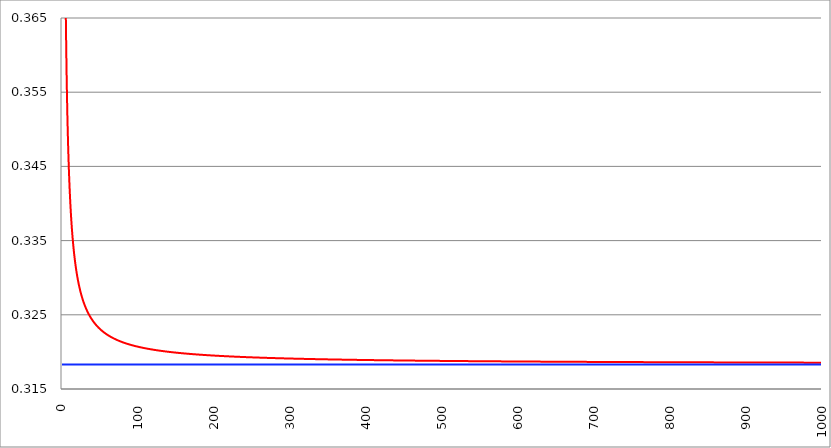
| Category | Series 1 | Series 0 | Series 2 |
|---|---|---|---|
| 0.0 | 1 |  | 0.318 |
| 1.0 | 0.447 |  | 0.318 |
| 2.0 | 0.423 |  | 0.318 |
| 3.0 | 0.394 |  | 0.318 |
| 4.0 | 0.377 |  | 0.318 |
| 5.0 | 0.366 |  | 0.318 |
| 6.0 | 0.358 |  | 0.318 |
| 7.0 | 0.352 |  | 0.318 |
| 8.0 | 0.348 |  | 0.318 |
| 9.0 | 0.345 |  | 0.318 |
| 10.0 | 0.342 |  | 0.318 |
| 11.0 | 0.34 |  | 0.318 |
| 12.0 | 0.338 |  | 0.318 |
| 13.0 | 0.337 |  | 0.318 |
| 14.0 | 0.335 |  | 0.318 |
| 15.0 | 0.334 |  | 0.318 |
| 16.0 | 0.333 |  | 0.318 |
| 17.0 | 0.332 |  | 0.318 |
| 18.0 | 0.332 |  | 0.318 |
| 19.0 | 0.331 |  | 0.318 |
| 20.0 | 0.33 |  | 0.318 |
| 21.0 | 0.33 |  | 0.318 |
| 22.0 | 0.329 |  | 0.318 |
| 23.0 | 0.329 |  | 0.318 |
| 24.0 | 0.328 |  | 0.318 |
| 25.0 | 0.328 |  | 0.318 |
| 26.0 | 0.327 |  | 0.318 |
| 27.0 | 0.327 |  | 0.318 |
| 28.0 | 0.327 |  | 0.318 |
| 29.0 | 0.327 |  | 0.318 |
| 30.0 | 0.326 |  | 0.318 |
| 31.0 | 0.326 |  | 0.318 |
| 32.0 | 0.326 |  | 0.318 |
| 33.0 | 0.326 |  | 0.318 |
| 34.0 | 0.325 |  | 0.318 |
| 35.0 | 0.325 |  | 0.318 |
| 36.0 | 0.325 |  | 0.318 |
| 37.0 | 0.325 |  | 0.318 |
| 38.0 | 0.325 |  | 0.318 |
| 39.0 | 0.324 |  | 0.318 |
| 40.0 | 0.324 |  | 0.318 |
| 41.0 | 0.324 |  | 0.318 |
| 42.0 | 0.324 |  | 0.318 |
| 43.0 | 0.324 |  | 0.318 |
| 44.0 | 0.324 |  | 0.318 |
| 45.0 | 0.324 |  | 0.318 |
| 46.0 | 0.323 |  | 0.318 |
| 47.0 | 0.323 |  | 0.318 |
| 48.0 | 0.323 |  | 0.318 |
| 49.0 | 0.323 |  | 0.318 |
| 50.0 | 0.323 |  | 0.318 |
| 51.0 | 0.323 |  | 0.318 |
| 52.0 | 0.323 |  | 0.318 |
| 53.0 | 0.323 |  | 0.318 |
| 54.0 | 0.323 |  | 0.318 |
| 55.0 | 0.323 |  | 0.318 |
| 56.0 | 0.323 |  | 0.318 |
| 57.0 | 0.322 |  | 0.318 |
| 58.0 | 0.322 |  | 0.318 |
| 59.0 | 0.322 |  | 0.318 |
| 60.0 | 0.322 |  | 0.318 |
| 61.0 | 0.322 |  | 0.318 |
| 62.0 | 0.322 |  | 0.318 |
| 63.0 | 0.322 |  | 0.318 |
| 64.0 | 0.322 |  | 0.318 |
| 65.0 | 0.322 |  | 0.318 |
| 66.0 | 0.322 |  | 0.318 |
| 67.0 | 0.322 |  | 0.318 |
| 68.0 | 0.322 |  | 0.318 |
| 69.0 | 0.322 |  | 0.318 |
| 70.0 | 0.322 |  | 0.318 |
| 71.0 | 0.322 |  | 0.318 |
| 72.0 | 0.322 |  | 0.318 |
| 73.0 | 0.322 |  | 0.318 |
| 74.0 | 0.322 |  | 0.318 |
| 75.0 | 0.321 |  | 0.318 |
| 76.0 | 0.321 |  | 0.318 |
| 77.0 | 0.321 |  | 0.318 |
| 78.0 | 0.321 |  | 0.318 |
| 79.0 | 0.321 |  | 0.318 |
| 80.0 | 0.321 |  | 0.318 |
| 81.0 | 0.321 |  | 0.318 |
| 82.0 | 0.321 |  | 0.318 |
| 83.0 | 0.321 |  | 0.318 |
| 84.0 | 0.321 |  | 0.318 |
| 85.0 | 0.321 |  | 0.318 |
| 86.0 | 0.321 |  | 0.318 |
| 87.0 | 0.321 |  | 0.318 |
| 88.0 | 0.321 |  | 0.318 |
| 89.0 | 0.321 |  | 0.318 |
| 90.0 | 0.321 |  | 0.318 |
| 91.0 | 0.321 |  | 0.318 |
| 92.0 | 0.321 |  | 0.318 |
| 93.0 | 0.321 |  | 0.318 |
| 94.0 | 0.321 |  | 0.318 |
| 95.0 | 0.321 |  | 0.318 |
| 96.0 | 0.321 |  | 0.318 |
| 97.0 | 0.321 |  | 0.318 |
| 98.0 | 0.321 |  | 0.318 |
| 99.0 | 0.321 |  | 0.318 |
| 100.0 | 0.321 |  | 0.318 |
| 101.0 | 0.321 |  | 0.318 |
| 102.0 | 0.321 |  | 0.318 |
| 103.0 | 0.321 |  | 0.318 |
| 104.0 | 0.321 |  | 0.318 |
| 105.0 | 0.321 |  | 0.318 |
| 106.0 | 0.321 |  | 0.318 |
| 107.0 | 0.321 |  | 0.318 |
| 108.0 | 0.321 |  | 0.318 |
| 109.0 | 0.32 |  | 0.318 |
| 110.0 | 0.32 |  | 0.318 |
| 111.0 | 0.32 |  | 0.318 |
| 112.0 | 0.32 |  | 0.318 |
| 113.0 | 0.32 |  | 0.318 |
| 114.0 | 0.32 |  | 0.318 |
| 115.0 | 0.32 |  | 0.318 |
| 116.0 | 0.32 |  | 0.318 |
| 117.0 | 0.32 |  | 0.318 |
| 118.0 | 0.32 |  | 0.318 |
| 119.0 | 0.32 |  | 0.318 |
| 120.0 | 0.32 |  | 0.318 |
| 121.0 | 0.32 |  | 0.318 |
| 122.0 | 0.32 |  | 0.318 |
| 123.0 | 0.32 |  | 0.318 |
| 124.0 | 0.32 |  | 0.318 |
| 125.0 | 0.32 |  | 0.318 |
| 126.0 | 0.32 |  | 0.318 |
| 127.0 | 0.32 |  | 0.318 |
| 128.0 | 0.32 |  | 0.318 |
| 129.0 | 0.32 |  | 0.318 |
| 130.0 | 0.32 |  | 0.318 |
| 131.0 | 0.32 |  | 0.318 |
| 132.0 | 0.32 |  | 0.318 |
| 133.0 | 0.32 |  | 0.318 |
| 134.0 | 0.32 |  | 0.318 |
| 135.0 | 0.32 |  | 0.318 |
| 136.0 | 0.32 |  | 0.318 |
| 137.0 | 0.32 |  | 0.318 |
| 138.0 | 0.32 |  | 0.318 |
| 139.0 | 0.32 |  | 0.318 |
| 140.0 | 0.32 |  | 0.318 |
| 141.0 | 0.32 |  | 0.318 |
| 142.0 | 0.32 |  | 0.318 |
| 143.0 | 0.32 |  | 0.318 |
| 144.0 | 0.32 |  | 0.318 |
| 145.0 | 0.32 |  | 0.318 |
| 146.0 | 0.32 |  | 0.318 |
| 147.0 | 0.32 |  | 0.318 |
| 148.0 | 0.32 |  | 0.318 |
| 149.0 | 0.32 |  | 0.318 |
| 150.0 | 0.32 |  | 0.318 |
| 151.0 | 0.32 |  | 0.318 |
| 152.0 | 0.32 |  | 0.318 |
| 153.0 | 0.32 |  | 0.318 |
| 154.0 | 0.32 |  | 0.318 |
| 155.0 | 0.32 |  | 0.318 |
| 156.0 | 0.32 |  | 0.318 |
| 157.0 | 0.32 |  | 0.318 |
| 158.0 | 0.32 |  | 0.318 |
| 159.0 | 0.32 |  | 0.318 |
| 160.0 | 0.32 |  | 0.318 |
| 161.0 | 0.32 |  | 0.318 |
| 162.0 | 0.32 |  | 0.318 |
| 163.0 | 0.32 |  | 0.318 |
| 164.0 | 0.32 |  | 0.318 |
| 165.0 | 0.32 |  | 0.318 |
| 166.0 | 0.32 |  | 0.318 |
| 167.0 | 0.32 |  | 0.318 |
| 168.0 | 0.32 |  | 0.318 |
| 169.0 | 0.32 |  | 0.318 |
| 170.0 | 0.32 |  | 0.318 |
| 171.0 | 0.32 |  | 0.318 |
| 172.0 | 0.32 |  | 0.318 |
| 173.0 | 0.32 |  | 0.318 |
| 174.0 | 0.32 |  | 0.318 |
| 175.0 | 0.32 |  | 0.318 |
| 176.0 | 0.32 |  | 0.318 |
| 177.0 | 0.32 |  | 0.318 |
| 178.0 | 0.32 |  | 0.318 |
| 179.0 | 0.32 |  | 0.318 |
| 180.0 | 0.32 |  | 0.318 |
| 181.0 | 0.32 |  | 0.318 |
| 182.0 | 0.32 |  | 0.318 |
| 183.0 | 0.32 |  | 0.318 |
| 184.0 | 0.32 |  | 0.318 |
| 185.0 | 0.32 |  | 0.318 |
| 186.0 | 0.32 |  | 0.318 |
| 187.0 | 0.32 |  | 0.318 |
| 188.0 | 0.32 |  | 0.318 |
| 189.0 | 0.32 |  | 0.318 |
| 190.0 | 0.32 |  | 0.318 |
| 191.0 | 0.32 |  | 0.318 |
| 192.0 | 0.32 |  | 0.318 |
| 193.0 | 0.32 |  | 0.318 |
| 194.0 | 0.32 |  | 0.318 |
| 195.0 | 0.32 |  | 0.318 |
| 196.0 | 0.32 |  | 0.318 |
| 197.0 | 0.32 |  | 0.318 |
| 198.0 | 0.32 |  | 0.318 |
| 199.0 | 0.32 |  | 0.318 |
| 200.0 | 0.32 |  | 0.318 |
| 201.0 | 0.319 |  | 0.318 |
| 202.0 | 0.319 |  | 0.318 |
| 203.0 | 0.319 |  | 0.318 |
| 204.0 | 0.319 |  | 0.318 |
| 205.0 | 0.319 |  | 0.318 |
| 206.0 | 0.319 |  | 0.318 |
| 207.0 | 0.319 |  | 0.318 |
| 208.0 | 0.319 |  | 0.318 |
| 209.0 | 0.319 |  | 0.318 |
| 210.0 | 0.319 |  | 0.318 |
| 211.0 | 0.319 |  | 0.318 |
| 212.0 | 0.319 |  | 0.318 |
| 213.0 | 0.319 |  | 0.318 |
| 214.0 | 0.319 |  | 0.318 |
| 215.0 | 0.319 |  | 0.318 |
| 216.0 | 0.319 |  | 0.318 |
| 217.0 | 0.319 |  | 0.318 |
| 218.0 | 0.319 |  | 0.318 |
| 219.0 | 0.319 |  | 0.318 |
| 220.0 | 0.319 |  | 0.318 |
| 221.0 | 0.319 |  | 0.318 |
| 222.0 | 0.319 |  | 0.318 |
| 223.0 | 0.319 |  | 0.318 |
| 224.0 | 0.319 |  | 0.318 |
| 225.0 | 0.319 |  | 0.318 |
| 226.0 | 0.319 |  | 0.318 |
| 227.0 | 0.319 |  | 0.318 |
| 228.0 | 0.319 |  | 0.318 |
| 229.0 | 0.319 |  | 0.318 |
| 230.0 | 0.319 |  | 0.318 |
| 231.0 | 0.319 |  | 0.318 |
| 232.0 | 0.319 |  | 0.318 |
| 233.0 | 0.319 |  | 0.318 |
| 234.0 | 0.319 |  | 0.318 |
| 235.0 | 0.319 |  | 0.318 |
| 236.0 | 0.319 |  | 0.318 |
| 237.0 | 0.319 |  | 0.318 |
| 238.0 | 0.319 |  | 0.318 |
| 239.0 | 0.319 |  | 0.318 |
| 240.0 | 0.319 |  | 0.318 |
| 241.0 | 0.319 |  | 0.318 |
| 242.0 | 0.319 |  | 0.318 |
| 243.0 | 0.319 |  | 0.318 |
| 244.0 | 0.319 |  | 0.318 |
| 245.0 | 0.319 |  | 0.318 |
| 246.0 | 0.319 |  | 0.318 |
| 247.0 | 0.319 |  | 0.318 |
| 248.0 | 0.319 |  | 0.318 |
| 249.0 | 0.319 |  | 0.318 |
| 250.0 | 0.319 |  | 0.318 |
| 251.0 | 0.319 |  | 0.318 |
| 252.0 | 0.319 |  | 0.318 |
| 253.0 | 0.319 |  | 0.318 |
| 254.0 | 0.319 |  | 0.318 |
| 255.0 | 0.319 |  | 0.318 |
| 256.0 | 0.319 |  | 0.318 |
| 257.0 | 0.319 |  | 0.318 |
| 258.0 | 0.319 |  | 0.318 |
| 259.0 | 0.319 |  | 0.318 |
| 260.0 | 0.319 |  | 0.318 |
| 261.0 | 0.319 |  | 0.318 |
| 262.0 | 0.319 |  | 0.318 |
| 263.0 | 0.319 |  | 0.318 |
| 264.0 | 0.319 |  | 0.318 |
| 265.0 | 0.319 |  | 0.318 |
| 266.0 | 0.319 |  | 0.318 |
| 267.0 | 0.319 |  | 0.318 |
| 268.0 | 0.319 |  | 0.318 |
| 269.0 | 0.319 |  | 0.318 |
| 270.0 | 0.319 |  | 0.318 |
| 271.0 | 0.319 |  | 0.318 |
| 272.0 | 0.319 |  | 0.318 |
| 273.0 | 0.319 |  | 0.318 |
| 274.0 | 0.319 |  | 0.318 |
| 275.0 | 0.319 |  | 0.318 |
| 276.0 | 0.319 |  | 0.318 |
| 277.0 | 0.319 |  | 0.318 |
| 278.0 | 0.319 |  | 0.318 |
| 279.0 | 0.319 |  | 0.318 |
| 280.0 | 0.319 |  | 0.318 |
| 281.0 | 0.319 |  | 0.318 |
| 282.0 | 0.319 |  | 0.318 |
| 283.0 | 0.319 |  | 0.318 |
| 284.0 | 0.319 |  | 0.318 |
| 285.0 | 0.319 |  | 0.318 |
| 286.0 | 0.319 |  | 0.318 |
| 287.0 | 0.319 |  | 0.318 |
| 288.0 | 0.319 |  | 0.318 |
| 289.0 | 0.319 |  | 0.318 |
| 290.0 | 0.319 |  | 0.318 |
| 291.0 | 0.319 |  | 0.318 |
| 292.0 | 0.319 |  | 0.318 |
| 293.0 | 0.319 |  | 0.318 |
| 294.0 | 0.319 |  | 0.318 |
| 295.0 | 0.319 |  | 0.318 |
| 296.0 | 0.319 |  | 0.318 |
| 297.0 | 0.319 |  | 0.318 |
| 298.0 | 0.319 |  | 0.318 |
| 299.0 | 0.319 |  | 0.318 |
| 300.0 | 0.319 |  | 0.318 |
| 301.0 | 0.319 |  | 0.318 |
| 302.0 | 0.319 |  | 0.318 |
| 303.0 | 0.319 |  | 0.318 |
| 304.0 | 0.319 |  | 0.318 |
| 305.0 | 0.319 |  | 0.318 |
| 306.0 | 0.319 |  | 0.318 |
| 307.0 | 0.319 |  | 0.318 |
| 308.0 | 0.319 |  | 0.318 |
| 309.0 | 0.319 |  | 0.318 |
| 310.0 | 0.319 |  | 0.318 |
| 311.0 | 0.319 |  | 0.318 |
| 312.0 | 0.319 |  | 0.318 |
| 313.0 | 0.319 |  | 0.318 |
| 314.0 | 0.319 |  | 0.318 |
| 315.0 | 0.319 |  | 0.318 |
| 316.0 | 0.319 |  | 0.318 |
| 317.0 | 0.319 |  | 0.318 |
| 318.0 | 0.319 |  | 0.318 |
| 319.0 | 0.319 |  | 0.318 |
| 320.0 | 0.319 |  | 0.318 |
| 321.0 | 0.319 |  | 0.318 |
| 322.0 | 0.319 |  | 0.318 |
| 323.0 | 0.319 |  | 0.318 |
| 324.0 | 0.319 |  | 0.318 |
| 325.0 | 0.319 |  | 0.318 |
| 326.0 | 0.319 |  | 0.318 |
| 327.0 | 0.319 |  | 0.318 |
| 328.0 | 0.319 |  | 0.318 |
| 329.0 | 0.319 |  | 0.318 |
| 330.0 | 0.319 |  | 0.318 |
| 331.0 | 0.319 |  | 0.318 |
| 332.0 | 0.319 |  | 0.318 |
| 333.0 | 0.319 |  | 0.318 |
| 334.0 | 0.319 |  | 0.318 |
| 335.0 | 0.319 |  | 0.318 |
| 336.0 | 0.319 |  | 0.318 |
| 337.0 | 0.319 |  | 0.318 |
| 338.0 | 0.319 |  | 0.318 |
| 339.0 | 0.319 |  | 0.318 |
| 340.0 | 0.319 |  | 0.318 |
| 341.0 | 0.319 |  | 0.318 |
| 342.0 | 0.319 |  | 0.318 |
| 343.0 | 0.319 |  | 0.318 |
| 344.0 | 0.319 |  | 0.318 |
| 345.0 | 0.319 |  | 0.318 |
| 346.0 | 0.319 |  | 0.318 |
| 347.0 | 0.319 |  | 0.318 |
| 348.0 | 0.319 |  | 0.318 |
| 349.0 | 0.319 |  | 0.318 |
| 350.0 | 0.319 |  | 0.318 |
| 351.0 | 0.319 |  | 0.318 |
| 352.0 | 0.319 |  | 0.318 |
| 353.0 | 0.319 |  | 0.318 |
| 354.0 | 0.319 |  | 0.318 |
| 355.0 | 0.319 |  | 0.318 |
| 356.0 | 0.319 |  | 0.318 |
| 357.0 | 0.319 |  | 0.318 |
| 358.0 | 0.319 |  | 0.318 |
| 359.0 | 0.319 |  | 0.318 |
| 360.0 | 0.319 |  | 0.318 |
| 361.0 | 0.319 |  | 0.318 |
| 362.0 | 0.319 |  | 0.318 |
| 363.0 | 0.319 |  | 0.318 |
| 364.0 | 0.319 |  | 0.318 |
| 365.0 | 0.319 |  | 0.318 |
| 366.0 | 0.319 |  | 0.318 |
| 367.0 | 0.319 |  | 0.318 |
| 368.0 | 0.319 |  | 0.318 |
| 369.0 | 0.319 |  | 0.318 |
| 370.0 | 0.319 |  | 0.318 |
| 371.0 | 0.319 |  | 0.318 |
| 372.0 | 0.319 |  | 0.318 |
| 373.0 | 0.319 |  | 0.318 |
| 374.0 | 0.319 |  | 0.318 |
| 375.0 | 0.319 |  | 0.318 |
| 376.0 | 0.319 |  | 0.318 |
| 377.0 | 0.319 |  | 0.318 |
| 378.0 | 0.319 |  | 0.318 |
| 379.0 | 0.319 |  | 0.318 |
| 380.0 | 0.319 |  | 0.318 |
| 381.0 | 0.319 |  | 0.318 |
| 382.0 | 0.319 |  | 0.318 |
| 383.0 | 0.319 |  | 0.318 |
| 384.0 | 0.319 |  | 0.318 |
| 385.0 | 0.319 |  | 0.318 |
| 386.0 | 0.319 |  | 0.318 |
| 387.0 | 0.319 |  | 0.318 |
| 388.0 | 0.319 |  | 0.318 |
| 389.0 | 0.319 |  | 0.318 |
| 390.0 | 0.319 |  | 0.318 |
| 391.0 | 0.319 |  | 0.318 |
| 392.0 | 0.319 |  | 0.318 |
| 393.0 | 0.319 |  | 0.318 |
| 394.0 | 0.319 |  | 0.318 |
| 395.0 | 0.319 |  | 0.318 |
| 396.0 | 0.319 |  | 0.318 |
| 397.0 | 0.319 |  | 0.318 |
| 398.0 | 0.319 |  | 0.318 |
| 399.0 | 0.319 |  | 0.318 |
| 400.0 | 0.319 |  | 0.318 |
| 401.0 | 0.319 |  | 0.318 |
| 402.0 | 0.319 |  | 0.318 |
| 403.0 | 0.319 |  | 0.318 |
| 404.0 | 0.319 |  | 0.318 |
| 405.0 | 0.319 |  | 0.318 |
| 406.0 | 0.319 |  | 0.318 |
| 407.0 | 0.319 |  | 0.318 |
| 408.0 | 0.319 |  | 0.318 |
| 409.0 | 0.319 |  | 0.318 |
| 410.0 | 0.319 |  | 0.318 |
| 411.0 | 0.319 |  | 0.318 |
| 412.0 | 0.319 |  | 0.318 |
| 413.0 | 0.319 |  | 0.318 |
| 414.0 | 0.319 |  | 0.318 |
| 415.0 | 0.319 |  | 0.318 |
| 416.0 | 0.319 |  | 0.318 |
| 417.0 | 0.319 |  | 0.318 |
| 418.0 | 0.319 |  | 0.318 |
| 419.0 | 0.319 |  | 0.318 |
| 420.0 | 0.319 |  | 0.318 |
| 421.0 | 0.319 |  | 0.318 |
| 422.0 | 0.319 |  | 0.318 |
| 423.0 | 0.319 |  | 0.318 |
| 424.0 | 0.319 |  | 0.318 |
| 425.0 | 0.319 |  | 0.318 |
| 426.0 | 0.319 |  | 0.318 |
| 427.0 | 0.319 |  | 0.318 |
| 428.0 | 0.319 |  | 0.318 |
| 429.0 | 0.319 |  | 0.318 |
| 430.0 | 0.319 |  | 0.318 |
| 431.0 | 0.319 |  | 0.318 |
| 432.0 | 0.319 |  | 0.318 |
| 433.0 | 0.319 |  | 0.318 |
| 434.0 | 0.319 |  | 0.318 |
| 435.0 | 0.319 |  | 0.318 |
| 436.0 | 0.319 |  | 0.318 |
| 437.0 | 0.319 |  | 0.318 |
| 438.0 | 0.319 |  | 0.318 |
| 439.0 | 0.319 |  | 0.318 |
| 440.0 | 0.319 |  | 0.318 |
| 441.0 | 0.319 |  | 0.318 |
| 442.0 | 0.319 |  | 0.318 |
| 443.0 | 0.319 |  | 0.318 |
| 444.0 | 0.319 |  | 0.318 |
| 445.0 | 0.319 |  | 0.318 |
| 446.0 | 0.319 |  | 0.318 |
| 447.0 | 0.319 |  | 0.318 |
| 448.0 | 0.319 |  | 0.318 |
| 449.0 | 0.319 |  | 0.318 |
| 450.0 | 0.319 |  | 0.318 |
| 451.0 | 0.319 |  | 0.318 |
| 452.0 | 0.319 |  | 0.318 |
| 453.0 | 0.319 |  | 0.318 |
| 454.0 | 0.319 |  | 0.318 |
| 455.0 | 0.319 |  | 0.318 |
| 456.0 | 0.319 |  | 0.318 |
| 457.0 | 0.319 |  | 0.318 |
| 458.0 | 0.319 |  | 0.318 |
| 459.0 | 0.319 |  | 0.318 |
| 460.0 | 0.319 |  | 0.318 |
| 461.0 | 0.319 |  | 0.318 |
| 462.0 | 0.319 |  | 0.318 |
| 463.0 | 0.319 |  | 0.318 |
| 464.0 | 0.319 |  | 0.318 |
| 465.0 | 0.319 |  | 0.318 |
| 466.0 | 0.319 |  | 0.318 |
| 467.0 | 0.319 |  | 0.318 |
| 468.0 | 0.319 |  | 0.318 |
| 469.0 | 0.319 |  | 0.318 |
| 470.0 | 0.319 |  | 0.318 |
| 471.0 | 0.319 |  | 0.318 |
| 472.0 | 0.319 |  | 0.318 |
| 473.0 | 0.319 |  | 0.318 |
| 474.0 | 0.319 |  | 0.318 |
| 475.0 | 0.319 |  | 0.318 |
| 476.0 | 0.319 |  | 0.318 |
| 477.0 | 0.319 |  | 0.318 |
| 478.0 | 0.319 |  | 0.318 |
| 479.0 | 0.319 |  | 0.318 |
| 480.0 | 0.319 |  | 0.318 |
| 481.0 | 0.319 |  | 0.318 |
| 482.0 | 0.319 |  | 0.318 |
| 483.0 | 0.319 |  | 0.318 |
| 484.0 | 0.319 |  | 0.318 |
| 485.0 | 0.319 |  | 0.318 |
| 486.0 | 0.319 |  | 0.318 |
| 487.0 | 0.319 |  | 0.318 |
| 488.0 | 0.319 |  | 0.318 |
| 489.0 | 0.319 |  | 0.318 |
| 490.0 | 0.319 |  | 0.318 |
| 491.0 | 0.319 |  | 0.318 |
| 492.0 | 0.319 |  | 0.318 |
| 493.0 | 0.319 |  | 0.318 |
| 494.0 | 0.319 |  | 0.318 |
| 495.0 | 0.319 |  | 0.318 |
| 496.0 | 0.319 |  | 0.318 |
| 497.0 | 0.319 |  | 0.318 |
| 498.0 | 0.319 |  | 0.318 |
| 499.0 | 0.319 |  | 0.318 |
| 500.0 | 0.319 |  | 0.318 |
| 501.0 | 0.319 |  | 0.318 |
| 502.0 | 0.319 |  | 0.318 |
| 503.0 | 0.319 |  | 0.318 |
| 504.0 | 0.319 |  | 0.318 |
| 505.0 | 0.319 |  | 0.318 |
| 506.0 | 0.319 |  | 0.318 |
| 507.0 | 0.319 |  | 0.318 |
| 508.0 | 0.319 |  | 0.318 |
| 509.0 | 0.319 |  | 0.318 |
| 510.0 | 0.319 |  | 0.318 |
| 511.0 | 0.319 |  | 0.318 |
| 512.0 | 0.319 |  | 0.318 |
| 513.0 | 0.319 |  | 0.318 |
| 514.0 | 0.319 |  | 0.318 |
| 515.0 | 0.319 |  | 0.318 |
| 516.0 | 0.319 |  | 0.318 |
| 517.0 | 0.319 |  | 0.318 |
| 518.0 | 0.319 |  | 0.318 |
| 519.0 | 0.319 |  | 0.318 |
| 520.0 | 0.319 |  | 0.318 |
| 521.0 | 0.319 |  | 0.318 |
| 522.0 | 0.319 |  | 0.318 |
| 523.0 | 0.319 |  | 0.318 |
| 524.0 | 0.319 |  | 0.318 |
| 525.0 | 0.319 |  | 0.318 |
| 526.0 | 0.319 |  | 0.318 |
| 527.0 | 0.319 |  | 0.318 |
| 528.0 | 0.319 |  | 0.318 |
| 529.0 | 0.319 |  | 0.318 |
| 530.0 | 0.319 |  | 0.318 |
| 531.0 | 0.319 |  | 0.318 |
| 532.0 | 0.319 |  | 0.318 |
| 533.0 | 0.319 |  | 0.318 |
| 534.0 | 0.319 |  | 0.318 |
| 535.0 | 0.319 |  | 0.318 |
| 536.0 | 0.319 |  | 0.318 |
| 537.0 | 0.319 |  | 0.318 |
| 538.0 | 0.319 |  | 0.318 |
| 539.0 | 0.319 |  | 0.318 |
| 540.0 | 0.319 |  | 0.318 |
| 541.0 | 0.319 |  | 0.318 |
| 542.0 | 0.319 |  | 0.318 |
| 543.0 | 0.319 |  | 0.318 |
| 544.0 | 0.319 |  | 0.318 |
| 545.0 | 0.319 |  | 0.318 |
| 546.0 | 0.319 |  | 0.318 |
| 547.0 | 0.319 |  | 0.318 |
| 548.0 | 0.319 |  | 0.318 |
| 549.0 | 0.319 |  | 0.318 |
| 550.0 | 0.319 |  | 0.318 |
| 551.0 | 0.319 |  | 0.318 |
| 552.0 | 0.319 |  | 0.318 |
| 553.0 | 0.319 |  | 0.318 |
| 554.0 | 0.319 |  | 0.318 |
| 555.0 | 0.319 |  | 0.318 |
| 556.0 | 0.319 |  | 0.318 |
| 557.0 | 0.319 |  | 0.318 |
| 558.0 | 0.319 |  | 0.318 |
| 559.0 | 0.319 |  | 0.318 |
| 560.0 | 0.319 |  | 0.318 |
| 561.0 | 0.319 |  | 0.318 |
| 562.0 | 0.319 |  | 0.318 |
| 563.0 | 0.319 |  | 0.318 |
| 564.0 | 0.319 |  | 0.318 |
| 565.0 | 0.319 |  | 0.318 |
| 566.0 | 0.319 |  | 0.318 |
| 567.0 | 0.319 |  | 0.318 |
| 568.0 | 0.319 |  | 0.318 |
| 569.0 | 0.319 |  | 0.318 |
| 570.0 | 0.319 |  | 0.318 |
| 571.0 | 0.319 |  | 0.318 |
| 572.0 | 0.319 |  | 0.318 |
| 573.0 | 0.319 |  | 0.318 |
| 574.0 | 0.319 |  | 0.318 |
| 575.0 | 0.319 |  | 0.318 |
| 576.0 | 0.319 |  | 0.318 |
| 577.0 | 0.319 |  | 0.318 |
| 578.0 | 0.319 |  | 0.318 |
| 579.0 | 0.319 |  | 0.318 |
| 580.0 | 0.319 |  | 0.318 |
| 581.0 | 0.319 |  | 0.318 |
| 582.0 | 0.319 |  | 0.318 |
| 583.0 | 0.319 |  | 0.318 |
| 584.0 | 0.319 |  | 0.318 |
| 585.0 | 0.319 |  | 0.318 |
| 586.0 | 0.319 |  | 0.318 |
| 587.0 | 0.319 |  | 0.318 |
| 588.0 | 0.319 |  | 0.318 |
| 589.0 | 0.319 |  | 0.318 |
| 590.0 | 0.319 |  | 0.318 |
| 591.0 | 0.319 |  | 0.318 |
| 592.0 | 0.319 |  | 0.318 |
| 593.0 | 0.319 |  | 0.318 |
| 594.0 | 0.319 |  | 0.318 |
| 595.0 | 0.319 |  | 0.318 |
| 596.0 | 0.319 |  | 0.318 |
| 597.0 | 0.319 |  | 0.318 |
| 598.0 | 0.319 |  | 0.318 |
| 599.0 | 0.319 |  | 0.318 |
| 600.0 | 0.319 |  | 0.318 |
| 601.0 | 0.319 |  | 0.318 |
| 602.0 | 0.319 |  | 0.318 |
| 603.0 | 0.319 |  | 0.318 |
| 604.0 | 0.319 |  | 0.318 |
| 605.0 | 0.319 |  | 0.318 |
| 606.0 | 0.319 |  | 0.318 |
| 607.0 | 0.319 |  | 0.318 |
| 608.0 | 0.319 |  | 0.318 |
| 609.0 | 0.319 |  | 0.318 |
| 610.0 | 0.319 |  | 0.318 |
| 611.0 | 0.319 |  | 0.318 |
| 612.0 | 0.319 |  | 0.318 |
| 613.0 | 0.319 |  | 0.318 |
| 614.0 | 0.319 |  | 0.318 |
| 615.0 | 0.319 |  | 0.318 |
| 616.0 | 0.319 |  | 0.318 |
| 617.0 | 0.319 |  | 0.318 |
| 618.0 | 0.319 |  | 0.318 |
| 619.0 | 0.319 |  | 0.318 |
| 620.0 | 0.319 |  | 0.318 |
| 621.0 | 0.319 |  | 0.318 |
| 622.0 | 0.319 |  | 0.318 |
| 623.0 | 0.319 |  | 0.318 |
| 624.0 | 0.319 |  | 0.318 |
| 625.0 | 0.319 |  | 0.318 |
| 626.0 | 0.319 |  | 0.318 |
| 627.0 | 0.319 |  | 0.318 |
| 628.0 | 0.319 |  | 0.318 |
| 629.0 | 0.319 |  | 0.318 |
| 630.0 | 0.319 |  | 0.318 |
| 631.0 | 0.319 |  | 0.318 |
| 632.0 | 0.319 |  | 0.318 |
| 633.0 | 0.319 |  | 0.318 |
| 634.0 | 0.319 |  | 0.318 |
| 635.0 | 0.319 |  | 0.318 |
| 636.0 | 0.319 |  | 0.318 |
| 637.0 | 0.319 |  | 0.318 |
| 638.0 | 0.319 |  | 0.318 |
| 639.0 | 0.319 |  | 0.318 |
| 640.0 | 0.319 |  | 0.318 |
| 641.0 | 0.319 |  | 0.318 |
| 642.0 | 0.319 |  | 0.318 |
| 643.0 | 0.319 |  | 0.318 |
| 644.0 | 0.319 |  | 0.318 |
| 645.0 | 0.319 |  | 0.318 |
| 646.0 | 0.319 |  | 0.318 |
| 647.0 | 0.319 |  | 0.318 |
| 648.0 | 0.319 |  | 0.318 |
| 649.0 | 0.319 |  | 0.318 |
| 650.0 | 0.319 |  | 0.318 |
| 651.0 | 0.319 |  | 0.318 |
| 652.0 | 0.319 |  | 0.318 |
| 653.0 | 0.319 |  | 0.318 |
| 654.0 | 0.319 |  | 0.318 |
| 655.0 | 0.319 |  | 0.318 |
| 656.0 | 0.319 |  | 0.318 |
| 657.0 | 0.319 |  | 0.318 |
| 658.0 | 0.319 |  | 0.318 |
| 659.0 | 0.319 |  | 0.318 |
| 660.0 | 0.319 |  | 0.318 |
| 661.0 | 0.319 |  | 0.318 |
| 662.0 | 0.319 |  | 0.318 |
| 663.0 | 0.319 |  | 0.318 |
| 664.0 | 0.319 |  | 0.318 |
| 665.0 | 0.319 |  | 0.318 |
| 666.0 | 0.319 |  | 0.318 |
| 667.0 | 0.319 |  | 0.318 |
| 668.0 | 0.319 |  | 0.318 |
| 669.0 | 0.319 |  | 0.318 |
| 670.0 | 0.319 |  | 0.318 |
| 671.0 | 0.319 |  | 0.318 |
| 672.0 | 0.319 |  | 0.318 |
| 673.0 | 0.319 |  | 0.318 |
| 674.0 | 0.319 |  | 0.318 |
| 675.0 | 0.319 |  | 0.318 |
| 676.0 | 0.319 |  | 0.318 |
| 677.0 | 0.319 |  | 0.318 |
| 678.0 | 0.319 |  | 0.318 |
| 679.0 | 0.319 |  | 0.318 |
| 680.0 | 0.319 |  | 0.318 |
| 681.0 | 0.319 |  | 0.318 |
| 682.0 | 0.319 |  | 0.318 |
| 683.0 | 0.319 |  | 0.318 |
| 684.0 | 0.319 |  | 0.318 |
| 685.0 | 0.319 |  | 0.318 |
| 686.0 | 0.319 |  | 0.318 |
| 687.0 | 0.319 |  | 0.318 |
| 688.0 | 0.319 |  | 0.318 |
| 689.0 | 0.319 |  | 0.318 |
| 690.0 | 0.319 |  | 0.318 |
| 691.0 | 0.319 |  | 0.318 |
| 692.0 | 0.319 |  | 0.318 |
| 693.0 | 0.319 |  | 0.318 |
| 694.0 | 0.319 |  | 0.318 |
| 695.0 | 0.319 |  | 0.318 |
| 696.0 | 0.319 |  | 0.318 |
| 697.0 | 0.319 |  | 0.318 |
| 698.0 | 0.319 |  | 0.318 |
| 699.0 | 0.319 |  | 0.318 |
| 700.0 | 0.319 |  | 0.318 |
| 701.0 | 0.319 |  | 0.318 |
| 702.0 | 0.319 |  | 0.318 |
| 703.0 | 0.319 |  | 0.318 |
| 704.0 | 0.319 |  | 0.318 |
| 705.0 | 0.319 |  | 0.318 |
| 706.0 | 0.319 |  | 0.318 |
| 707.0 | 0.319 |  | 0.318 |
| 708.0 | 0.319 |  | 0.318 |
| 709.0 | 0.319 |  | 0.318 |
| 710.0 | 0.319 |  | 0.318 |
| 711.0 | 0.319 |  | 0.318 |
| 712.0 | 0.319 |  | 0.318 |
| 713.0 | 0.319 |  | 0.318 |
| 714.0 | 0.319 |  | 0.318 |
| 715.0 | 0.319 |  | 0.318 |
| 716.0 | 0.319 |  | 0.318 |
| 717.0 | 0.319 |  | 0.318 |
| 718.0 | 0.319 |  | 0.318 |
| 719.0 | 0.319 |  | 0.318 |
| 720.0 | 0.319 |  | 0.318 |
| 721.0 | 0.319 |  | 0.318 |
| 722.0 | 0.319 |  | 0.318 |
| 723.0 | 0.319 |  | 0.318 |
| 724.0 | 0.319 |  | 0.318 |
| 725.0 | 0.319 |  | 0.318 |
| 726.0 | 0.319 |  | 0.318 |
| 727.0 | 0.319 |  | 0.318 |
| 728.0 | 0.319 |  | 0.318 |
| 729.0 | 0.319 |  | 0.318 |
| 730.0 | 0.319 |  | 0.318 |
| 731.0 | 0.319 |  | 0.318 |
| 732.0 | 0.319 |  | 0.318 |
| 733.0 | 0.319 |  | 0.318 |
| 734.0 | 0.319 |  | 0.318 |
| 735.0 | 0.319 |  | 0.318 |
| 736.0 | 0.319 |  | 0.318 |
| 737.0 | 0.319 |  | 0.318 |
| 738.0 | 0.319 |  | 0.318 |
| 739.0 | 0.319 |  | 0.318 |
| 740.0 | 0.319 |  | 0.318 |
| 741.0 | 0.319 |  | 0.318 |
| 742.0 | 0.319 |  | 0.318 |
| 743.0 | 0.319 |  | 0.318 |
| 744.0 | 0.319 |  | 0.318 |
| 745.0 | 0.319 |  | 0.318 |
| 746.0 | 0.319 |  | 0.318 |
| 747.0 | 0.319 |  | 0.318 |
| 748.0 | 0.319 |  | 0.318 |
| 749.0 | 0.319 |  | 0.318 |
| 750.0 | 0.319 |  | 0.318 |
| 751.0 | 0.319 |  | 0.318 |
| 752.0 | 0.319 |  | 0.318 |
| 753.0 | 0.319 |  | 0.318 |
| 754.0 | 0.319 |  | 0.318 |
| 755.0 | 0.319 |  | 0.318 |
| 756.0 | 0.319 |  | 0.318 |
| 757.0 | 0.319 |  | 0.318 |
| 758.0 | 0.319 |  | 0.318 |
| 759.0 | 0.319 |  | 0.318 |
| 760.0 | 0.319 |  | 0.318 |
| 761.0 | 0.319 |  | 0.318 |
| 762.0 | 0.319 |  | 0.318 |
| 763.0 | 0.319 |  | 0.318 |
| 764.0 | 0.319 |  | 0.318 |
| 765.0 | 0.319 |  | 0.318 |
| 766.0 | 0.319 |  | 0.318 |
| 767.0 | 0.319 |  | 0.318 |
| 768.0 | 0.319 |  | 0.318 |
| 769.0 | 0.319 |  | 0.318 |
| 770.0 | 0.319 |  | 0.318 |
| 771.0 | 0.319 |  | 0.318 |
| 772.0 | 0.319 |  | 0.318 |
| 773.0 | 0.319 |  | 0.318 |
| 774.0 | 0.319 |  | 0.318 |
| 775.0 | 0.319 |  | 0.318 |
| 776.0 | 0.319 |  | 0.318 |
| 777.0 | 0.319 |  | 0.318 |
| 778.0 | 0.319 |  | 0.318 |
| 779.0 | 0.319 |  | 0.318 |
| 780.0 | 0.319 |  | 0.318 |
| 781.0 | 0.319 |  | 0.318 |
| 782.0 | 0.319 |  | 0.318 |
| 783.0 | 0.319 |  | 0.318 |
| 784.0 | 0.319 |  | 0.318 |
| 785.0 | 0.319 |  | 0.318 |
| 786.0 | 0.319 |  | 0.318 |
| 787.0 | 0.319 |  | 0.318 |
| 788.0 | 0.319 |  | 0.318 |
| 789.0 | 0.319 |  | 0.318 |
| 790.0 | 0.319 |  | 0.318 |
| 791.0 | 0.319 |  | 0.318 |
| 792.0 | 0.319 |  | 0.318 |
| 793.0 | 0.319 |  | 0.318 |
| 794.0 | 0.319 |  | 0.318 |
| 795.0 | 0.319 |  | 0.318 |
| 796.0 | 0.319 |  | 0.318 |
| 797.0 | 0.319 |  | 0.318 |
| 798.0 | 0.319 |  | 0.318 |
| 799.0 | 0.319 |  | 0.318 |
| 800.0 | 0.319 |  | 0.318 |
| 801.0 | 0.319 |  | 0.318 |
| 802.0 | 0.319 |  | 0.318 |
| 803.0 | 0.319 |  | 0.318 |
| 804.0 | 0.319 |  | 0.318 |
| 805.0 | 0.319 |  | 0.318 |
| 806.0 | 0.319 |  | 0.318 |
| 807.0 | 0.319 |  | 0.318 |
| 808.0 | 0.319 |  | 0.318 |
| 809.0 | 0.319 |  | 0.318 |
| 810.0 | 0.319 |  | 0.318 |
| 811.0 | 0.319 |  | 0.318 |
| 812.0 | 0.319 |  | 0.318 |
| 813.0 | 0.319 |  | 0.318 |
| 814.0 | 0.319 |  | 0.318 |
| 815.0 | 0.319 |  | 0.318 |
| 816.0 | 0.319 |  | 0.318 |
| 817.0 | 0.319 |  | 0.318 |
| 818.0 | 0.319 |  | 0.318 |
| 819.0 | 0.319 |  | 0.318 |
| 820.0 | 0.319 |  | 0.318 |
| 821.0 | 0.319 |  | 0.318 |
| 822.0 | 0.319 |  | 0.318 |
| 823.0 | 0.319 |  | 0.318 |
| 824.0 | 0.319 |  | 0.318 |
| 825.0 | 0.319 |  | 0.318 |
| 826.0 | 0.319 |  | 0.318 |
| 827.0 | 0.319 |  | 0.318 |
| 828.0 | 0.319 |  | 0.318 |
| 829.0 | 0.319 |  | 0.318 |
| 830.0 | 0.319 |  | 0.318 |
| 831.0 | 0.319 |  | 0.318 |
| 832.0 | 0.319 |  | 0.318 |
| 833.0 | 0.319 |  | 0.318 |
| 834.0 | 0.319 |  | 0.318 |
| 835.0 | 0.319 |  | 0.318 |
| 836.0 | 0.319 |  | 0.318 |
| 837.0 | 0.319 |  | 0.318 |
| 838.0 | 0.319 |  | 0.318 |
| 839.0 | 0.319 |  | 0.318 |
| 840.0 | 0.319 |  | 0.318 |
| 841.0 | 0.319 |  | 0.318 |
| 842.0 | 0.319 |  | 0.318 |
| 843.0 | 0.319 |  | 0.318 |
| 844.0 | 0.319 |  | 0.318 |
| 845.0 | 0.319 |  | 0.318 |
| 846.0 | 0.319 |  | 0.318 |
| 847.0 | 0.319 |  | 0.318 |
| 848.0 | 0.319 |  | 0.318 |
| 849.0 | 0.319 |  | 0.318 |
| 850.0 | 0.319 |  | 0.318 |
| 851.0 | 0.319 |  | 0.318 |
| 852.0 | 0.319 |  | 0.318 |
| 853.0 | 0.319 |  | 0.318 |
| 854.0 | 0.319 |  | 0.318 |
| 855.0 | 0.319 |  | 0.318 |
| 856.0 | 0.319 |  | 0.318 |
| 857.0 | 0.319 |  | 0.318 |
| 858.0 | 0.319 |  | 0.318 |
| 859.0 | 0.319 |  | 0.318 |
| 860.0 | 0.319 |  | 0.318 |
| 861.0 | 0.319 |  | 0.318 |
| 862.0 | 0.319 |  | 0.318 |
| 863.0 | 0.319 |  | 0.318 |
| 864.0 | 0.319 |  | 0.318 |
| 865.0 | 0.319 |  | 0.318 |
| 866.0 | 0.319 |  | 0.318 |
| 867.0 | 0.319 |  | 0.318 |
| 868.0 | 0.319 |  | 0.318 |
| 869.0 | 0.319 |  | 0.318 |
| 870.0 | 0.319 |  | 0.318 |
| 871.0 | 0.319 |  | 0.318 |
| 872.0 | 0.319 |  | 0.318 |
| 873.0 | 0.319 |  | 0.318 |
| 874.0 | 0.319 |  | 0.318 |
| 875.0 | 0.319 |  | 0.318 |
| 876.0 | 0.319 |  | 0.318 |
| 877.0 | 0.319 |  | 0.318 |
| 878.0 | 0.319 |  | 0.318 |
| 879.0 | 0.319 |  | 0.318 |
| 880.0 | 0.319 |  | 0.318 |
| 881.0 | 0.319 |  | 0.318 |
| 882.0 | 0.319 |  | 0.318 |
| 883.0 | 0.319 |  | 0.318 |
| 884.0 | 0.319 |  | 0.318 |
| 885.0 | 0.319 |  | 0.318 |
| 886.0 | 0.319 |  | 0.318 |
| 887.0 | 0.319 |  | 0.318 |
| 888.0 | 0.319 |  | 0.318 |
| 889.0 | 0.319 |  | 0.318 |
| 890.0 | 0.319 |  | 0.318 |
| 891.0 | 0.319 |  | 0.318 |
| 892.0 | 0.319 |  | 0.318 |
| 893.0 | 0.319 |  | 0.318 |
| 894.0 | 0.319 |  | 0.318 |
| 895.0 | 0.319 |  | 0.318 |
| 896.0 | 0.319 |  | 0.318 |
| 897.0 | 0.319 |  | 0.318 |
| 898.0 | 0.319 |  | 0.318 |
| 899.0 | 0.319 |  | 0.318 |
| 900.0 | 0.319 |  | 0.318 |
| 901.0 | 0.319 |  | 0.318 |
| 902.0 | 0.319 |  | 0.318 |
| 903.0 | 0.319 |  | 0.318 |
| 904.0 | 0.319 |  | 0.318 |
| 905.0 | 0.319 |  | 0.318 |
| 906.0 | 0.319 |  | 0.318 |
| 907.0 | 0.319 |  | 0.318 |
| 908.0 | 0.319 |  | 0.318 |
| 909.0 | 0.319 |  | 0.318 |
| 910.0 | 0.319 |  | 0.318 |
| 911.0 | 0.319 |  | 0.318 |
| 912.0 | 0.319 |  | 0.318 |
| 913.0 | 0.319 |  | 0.318 |
| 914.0 | 0.319 |  | 0.318 |
| 915.0 | 0.319 |  | 0.318 |
| 916.0 | 0.319 |  | 0.318 |
| 917.0 | 0.319 |  | 0.318 |
| 918.0 | 0.319 |  | 0.318 |
| 919.0 | 0.319 |  | 0.318 |
| 920.0 | 0.319 |  | 0.318 |
| 921.0 | 0.319 |  | 0.318 |
| 922.0 | 0.319 |  | 0.318 |
| 923.0 | 0.319 |  | 0.318 |
| 924.0 | 0.319 |  | 0.318 |
| 925.0 | 0.319 |  | 0.318 |
| 926.0 | 0.319 |  | 0.318 |
| 927.0 | 0.319 |  | 0.318 |
| 928.0 | 0.319 |  | 0.318 |
| 929.0 | 0.319 |  | 0.318 |
| 930.0 | 0.319 |  | 0.318 |
| 931.0 | 0.319 |  | 0.318 |
| 932.0 | 0.319 |  | 0.318 |
| 933.0 | 0.319 |  | 0.318 |
| 934.0 | 0.319 |  | 0.318 |
| 935.0 | 0.319 |  | 0.318 |
| 936.0 | 0.319 |  | 0.318 |
| 937.0 | 0.319 |  | 0.318 |
| 938.0 | 0.319 |  | 0.318 |
| 939.0 | 0.319 |  | 0.318 |
| 940.0 | 0.319 |  | 0.318 |
| 941.0 | 0.319 |  | 0.318 |
| 942.0 | 0.319 |  | 0.318 |
| 943.0 | 0.319 |  | 0.318 |
| 944.0 | 0.319 |  | 0.318 |
| 945.0 | 0.319 |  | 0.318 |
| 946.0 | 0.319 |  | 0.318 |
| 947.0 | 0.319 |  | 0.318 |
| 948.0 | 0.319 |  | 0.318 |
| 949.0 | 0.319 |  | 0.318 |
| 950.0 | 0.319 |  | 0.318 |
| 951.0 | 0.319 |  | 0.318 |
| 952.0 | 0.319 |  | 0.318 |
| 953.0 | 0.319 |  | 0.318 |
| 954.0 | 0.319 |  | 0.318 |
| 955.0 | 0.319 |  | 0.318 |
| 956.0 | 0.319 |  | 0.318 |
| 957.0 | 0.319 |  | 0.318 |
| 958.0 | 0.319 |  | 0.318 |
| 959.0 | 0.319 |  | 0.318 |
| 960.0 | 0.319 |  | 0.318 |
| 961.0 | 0.319 |  | 0.318 |
| 962.0 | 0.319 |  | 0.318 |
| 963.0 | 0.319 |  | 0.318 |
| 964.0 | 0.319 |  | 0.318 |
| 965.0 | 0.319 |  | 0.318 |
| 966.0 | 0.319 |  | 0.318 |
| 967.0 | 0.319 |  | 0.318 |
| 968.0 | 0.319 |  | 0.318 |
| 969.0 | 0.319 |  | 0.318 |
| 970.0 | 0.319 |  | 0.318 |
| 971.0 | 0.319 |  | 0.318 |
| 972.0 | 0.319 |  | 0.318 |
| 973.0 | 0.319 |  | 0.318 |
| 974.0 | 0.319 |  | 0.318 |
| 975.0 | 0.319 |  | 0.318 |
| 976.0 | 0.319 |  | 0.318 |
| 977.0 | 0.319 |  | 0.318 |
| 978.0 | 0.319 |  | 0.318 |
| 979.0 | 0.319 |  | 0.318 |
| 980.0 | 0.319 |  | 0.318 |
| 981.0 | 0.319 |  | 0.318 |
| 982.0 | 0.319 |  | 0.318 |
| 983.0 | 0.319 |  | 0.318 |
| 984.0 | 0.319 |  | 0.318 |
| 985.0 | 0.319 |  | 0.318 |
| 986.0 | 0.319 |  | 0.318 |
| 987.0 | 0.319 |  | 0.318 |
| 988.0 | 0.319 |  | 0.318 |
| 989.0 | 0.319 |  | 0.318 |
| 990.0 | 0.319 |  | 0.318 |
| 991.0 | 0.319 |  | 0.318 |
| 992.0 | 0.319 |  | 0.318 |
| 993.0 | 0.319 |  | 0.318 |
| 994.0 | 0.319 |  | 0.318 |
| 995.0 | 0.319 |  | 0.318 |
| 996.0 | 0.319 |  | 0.318 |
| 997.0 | 0.319 |  | 0.318 |
| 998.0 | 0.319 |  | 0.318 |
| 999.0 | 0.319 |  | 0.318 |
| 1000.0 | 0.319 |  | 0.318 |